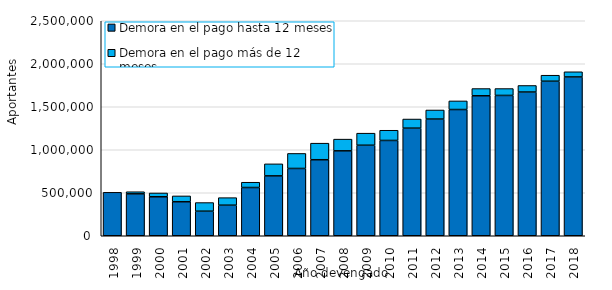
| Category | Demora en el pago hasta 12 meses | Demora en el pago más de 12 meses |
|---|---|---|
| 1998.0 | 505212.5 | 0 |
| 1999.0 | 487629 | 24284 |
| 2000.0 | 453455 | 43841 |
| 2001.0 | 395644 | 67614 |
| 2002.0 | 285472 | 100591 |
| 2003.0 | 355516 | 87523 |
| 2004.0 | 561027 | 61353 |
| 2005.0 | 696289 | 139739 |
| 2006.0 | 782437 | 174741 |
| 2007.0 | 883974 | 192558 |
| 2008.0 | 987323 | 136351 |
| 2009.0 | 1052552 | 140322 |
| 2010.0 | 1108255 | 118491 |
| 2011.0 | 1251129 | 106173 |
| 2012.0 | 1356923 | 105333 |
| 2013.0 | 1467801 | 100082 |
| 2014.0 | 1627865 | 83951 |
| 2015.0 | 1631687 | 79996 |
| 2016.0 | 1671205 | 76113 |
| 2017.0 | 1796779 | 69975 |
| 2018.0 | 1846551 | 60188 |